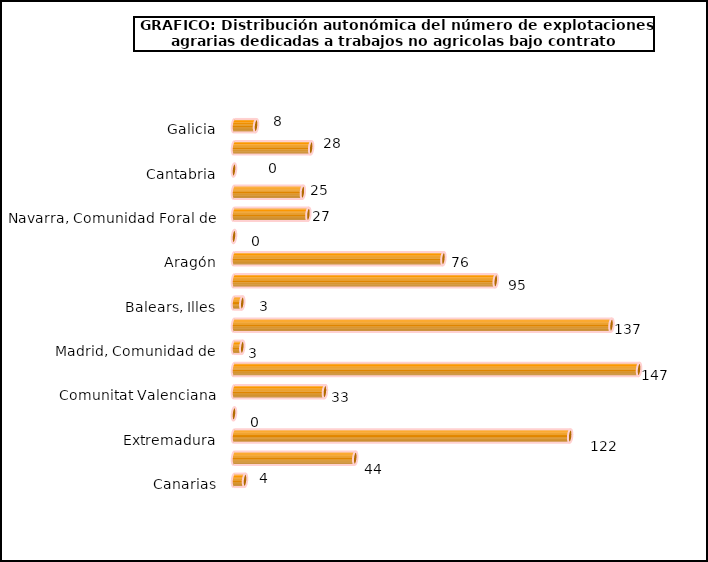
| Category | Series 0 |
|---|---|
| Galicia | 8 |
| Asturias, Principado de | 28 |
| Cantabria | 0 |
| País Vasco | 25 |
| Navarra, Comunidad Foral de | 27 |
| Rioja, La | 0 |
| Aragón | 76 |
| Cataluña | 95 |
| Balears, Illes | 3 |
| Castilla y León | 137 |
| Madrid, Comunidad de | 3 |
| Castilla - La Mancha | 147 |
| Comunitat Valenciana | 33 |
| Murcia, Región de | 0 |
| Extremadura | 122 |
| Andalucía | 44 |
| Canarias | 4 |